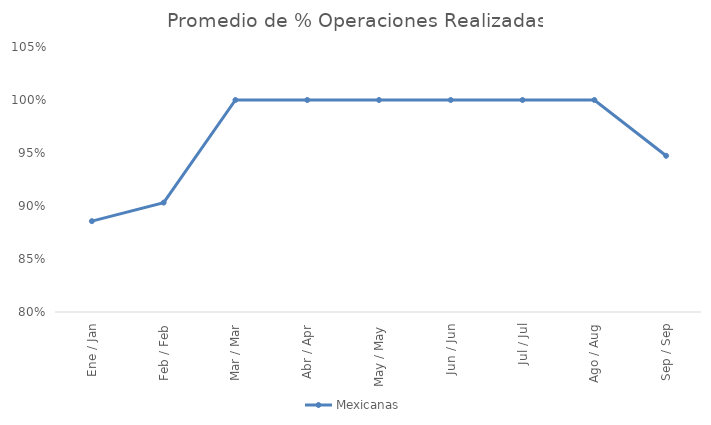
| Category | Mexicanas |
|---|---|
| Ene / Jan | 0.886 |
| Feb / Feb | 0.903 |
| Mar / Mar | 1 |
| Abr / Apr | 1 |
| May / May | 1 |
| Jun / Jun | 1 |
| Jul / Jul | 1 |
| Ago / Aug | 1 |
| Sep / Sep | 0.947 |